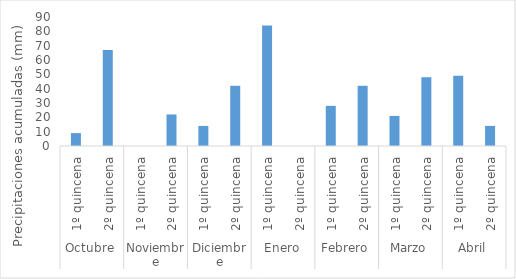
| Category | Series 0 |
|---|---|
| 0 | 9 |
| 1 | 67 |
| 2 | 0 |
| 3 | 22 |
| 4 | 14 |
| 5 | 42 |
| 6 | 84 |
| 7 | 0 |
| 8 | 28 |
| 9 | 42 |
| 10 | 21 |
| 11 | 48 |
| 12 | 49 |
| 13 | 14 |